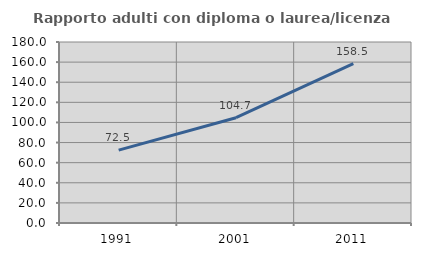
| Category | Rapporto adulti con diploma o laurea/licenza media  |
|---|---|
| 1991.0 | 72.458 |
| 2001.0 | 104.73 |
| 2011.0 | 158.537 |